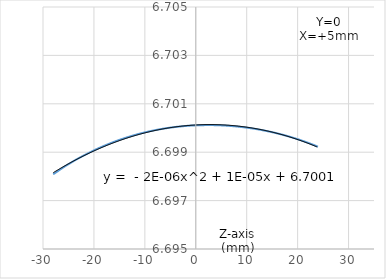
| Category | Series 0 |
|---|---|
| -28.0 | 6.698 |
| -27.0 | 6.698 |
| -26.0 | 6.698 |
| -25.0 | 6.699 |
| -25.0 | 6.699 |
| -24.0 | 6.699 |
| -23.0 | 6.699 |
| -22.0 | 6.699 |
| -21.0 | 6.699 |
| -20.0 | 6.699 |
| -19.0 | 6.699 |
| -18.0 | 6.699 |
| -17.0 | 6.699 |
| -16.0 | 6.699 |
| -15.0 | 6.7 |
| -14.0 | 6.7 |
| -13.0 | 6.7 |
| -12.0 | 6.7 |
| -11.0 | 6.7 |
| -10.0 | 6.7 |
| -9.0 | 6.7 |
| -8.0 | 6.7 |
| -7.0 | 6.7 |
| -6.0 | 6.7 |
| -5.0 | 6.7 |
| -4.0 | 6.7 |
| -3.0 | 6.7 |
| -2.0 | 6.7 |
| -1.0 | 6.7 |
| 0.0 | 6.7 |
| 1.0 | 6.7 |
| 2.0 | 6.7 |
| 3.0 | 6.7 |
| 4.0 | 6.7 |
| 5.0 | 6.7 |
| 6.0 | 6.7 |
| 7.0 | 6.7 |
| 8.0 | 6.7 |
| 9.0 | 6.7 |
| 10.0 | 6.7 |
| 11.0 | 6.7 |
| 12.0 | 6.7 |
| 13.0 | 6.7 |
| 14.0 | 6.7 |
| 15.0 | 6.7 |
| 16.0 | 6.7 |
| 17.0 | 6.7 |
| 18.0 | 6.7 |
| 19.0 | 6.7 |
| 20.0 | 6.7 |
| 21.0 | 6.699 |
| 22.0 | 6.699 |
| 23.0 | 6.699 |
| 24.0 | 6.699 |